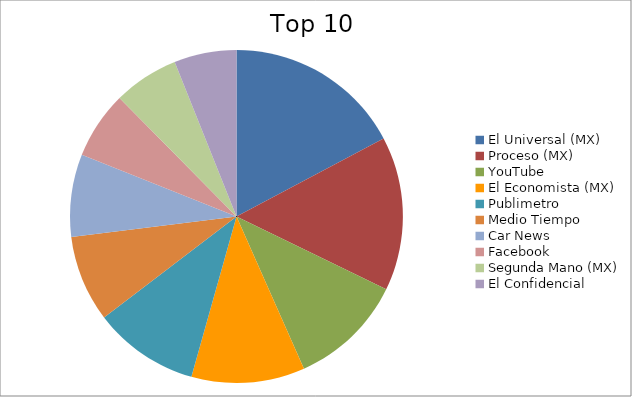
| Category | Series 0 |
|---|---|
| El Universal (MX) | 4.7 |
| Proceso (MX) | 4.08 |
| YouTube | 3.04 |
| El Economista (MX) | 3 |
| Publimetro | 2.8 |
| Medio Tiempo | 2.29 |
| Car News | 2.18 |
| Facebook | 1.79 |
| Segunda Mano (MX) | 1.73 |
| El Confidencial | 1.65 |